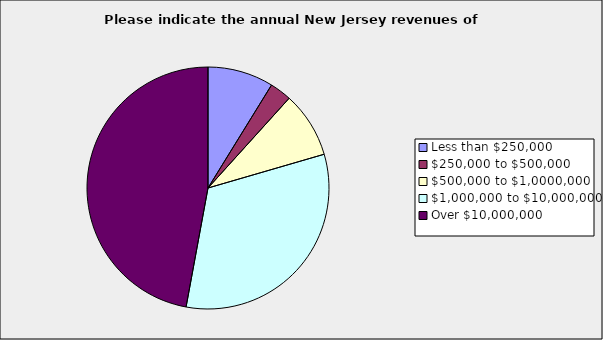
| Category | Series 0 |
|---|---|
| Less than $250,000 | 0.088 |
| $250,000 to $500,000 | 0.029 |
| $500,000 to $1,0000,000 | 0.088 |
| $1,000,000 to $10,000,000 | 0.324 |
| Over $10,000,000 | 0.471 |